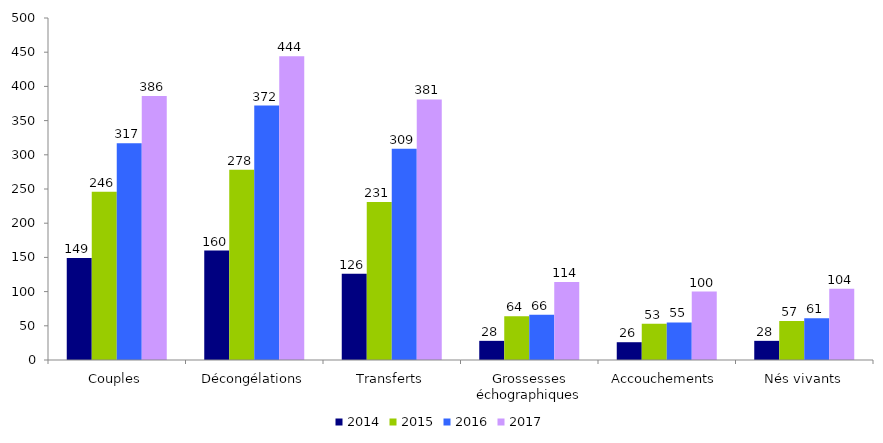
| Category | 2014 | 2015 | 2016 | 2017 |
|---|---|---|---|---|
| Couples | 149 | 246 | 317 | 386 |
| Décongélations | 160 | 278 | 372 | 444 |
| Transferts | 126 | 231 | 309 | 381 |
| Grossesses échographiques | 28 | 64 | 66 | 114 |
| Accouchements | 26 | 53 | 55 | 100 |
| Nés vivants | 28 | 57 | 61 | 104 |